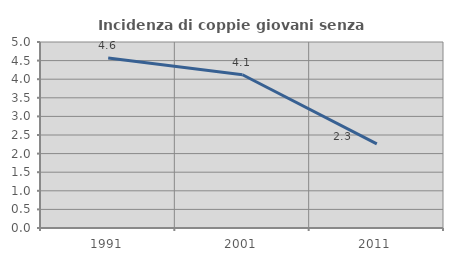
| Category | Incidenza di coppie giovani senza figli |
|---|---|
| 1991.0 | 4.57 |
| 2001.0 | 4.121 |
| 2011.0 | 2.262 |